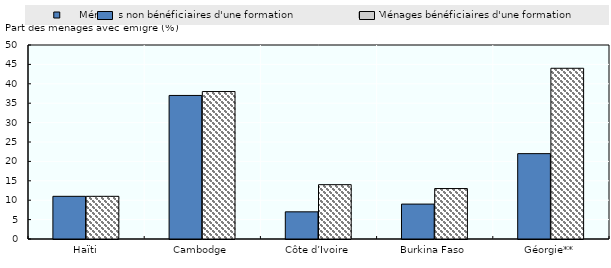
| Category |      Ménages non bénéficiaires d'une formation |    Ménages bénéficiaires d'une formation |
|---|---|---|
| Haïti | 11 | 11 |
| Cambodge | 37 | 38 |
| Côte d’Ivoire | 7 | 14 |
| Burkina Faso | 9 | 13 |
| Géorgie** | 22 | 44 |